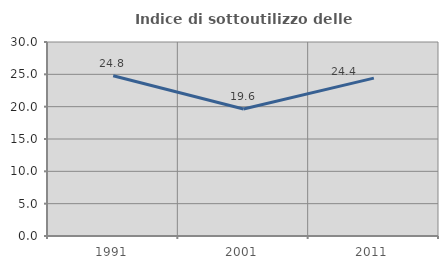
| Category | Indice di sottoutilizzo delle abitazioni  |
|---|---|
| 1991.0 | 24.784 |
| 2001.0 | 19.639 |
| 2011.0 | 24.412 |